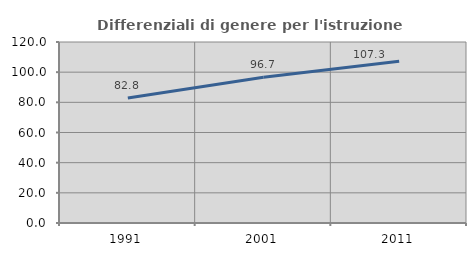
| Category | Differenziali di genere per l'istruzione superiore |
|---|---|
| 1991.0 | 82.842 |
| 2001.0 | 96.698 |
| 2011.0 | 107.261 |